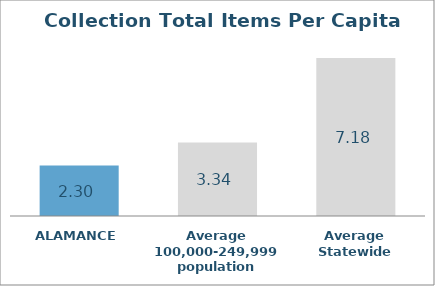
| Category | Series 0 |
|---|---|
| ALAMANCE | 2.301 |
| Average 100,000-249,999 population | 3.337 |
| Average Statewide | 7.183 |